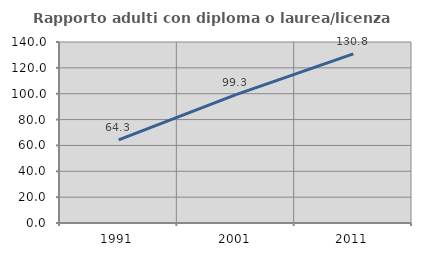
| Category | Rapporto adulti con diploma o laurea/licenza media  |
|---|---|
| 1991.0 | 64.331 |
| 2001.0 | 99.32 |
| 2011.0 | 130.795 |